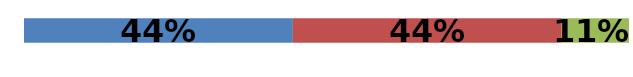
| Category | Series 0 | Series 1 | Series 2 |
|---|---|---|---|
| 0 | 0.444 | 0.444 | 0.111 |